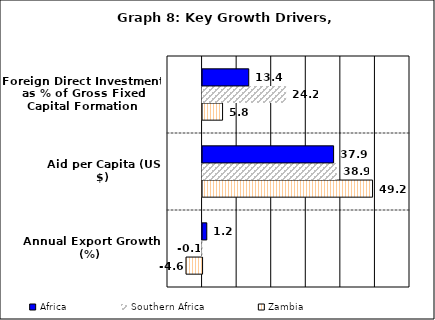
| Category | Zambia | Southern Africa | Africa |
|---|---|---|---|
| Annual Export Growth (%) | -4.65 | -0.056 | 1.219 |
| Aid per Capita (US $) | 49.17 | 38.854 | 37.904 |
| Foreign Direct Investment as % of Gross Fixed Capital Formation | 5.784 | 24.179 | 13.354 |